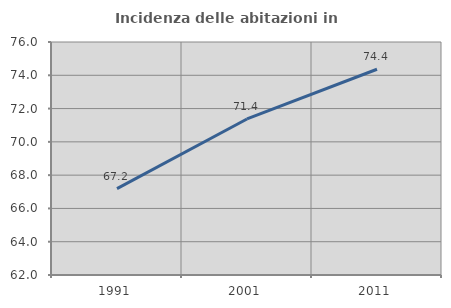
| Category | Incidenza delle abitazioni in proprietà  |
|---|---|
| 1991.0 | 67.187 |
| 2001.0 | 71.376 |
| 2011.0 | 74.363 |